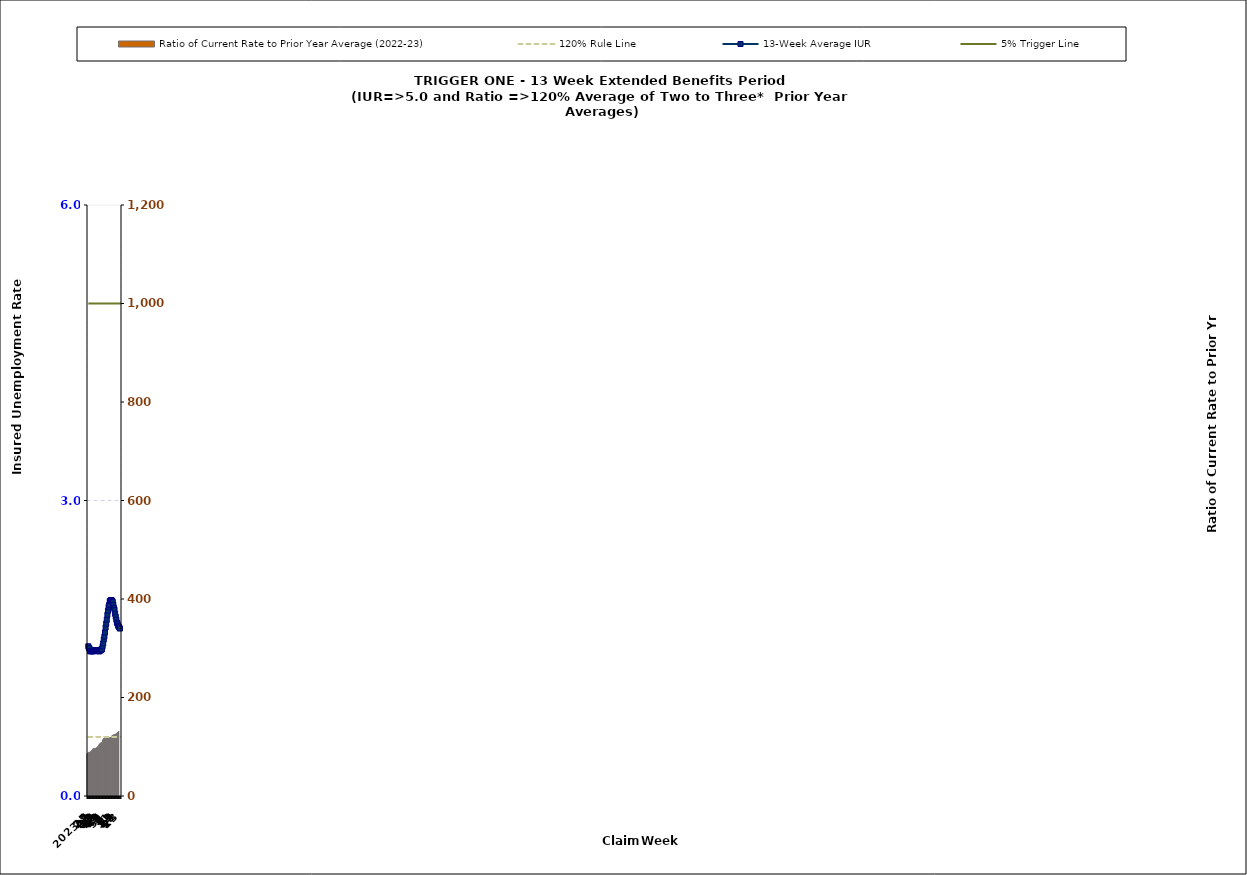
| Category | Ratio of Current Rate to Prior Year Average (2022-23) |
|---|---|
| 2023-23 | 86.11 |
| 2023-24 | 87.2 |
| 25 | 88.75 |
| 26 | 87.5 |
| 27 | 88.82 |
| 28 | 89.63 |
| 29 | 90.18 |
| 30 | 90.74 |
| 31 | 93.03 |
| 32 | 94.53 |
| 33 | 95.79 |
| 34 | 96.1 |
| 35 | 97.04 |
| 36 | 96.1 |
| 37 | 96.41 |
| 38 | 97.68 |
| 39 | 98.33 |
| 40 | 98.98 |
| 41 | 100.68 |
| 42 | 102.08 |
| 43 | 104.22 |
| 44 | 105.71 |
| 45 | 106.81 |
| 46 | 107.97 |
| 47 | 108.57 |
| 48 | 109.54 |
| 49 | 113.57 |
| 50 | 115.71 |
| 51 | 116.9 |
| 52 | 117.52 |
| 1 | 117.44 |
| 2 | 116.99 |
| 3 | 117.94 |
| 4 | 117.86 |
| 5 | 118.15 |
| 6 | 118.29 |
| 7 | 118.2 |
| 8 | 117.85 |
| 9 | 118.45 |
| 10 | 118.8 |
| 11 | 118.91 |
| 12 | 119.75 |
| 13 | 122.78 |
| 14 | 123.22 |
| 15 | 124.34 |
| 16 | 124.16 |
| 17 | 124.65 |
| 18 | 125.17 |
| 19 | 125.26 |
| 20 | 126.81 |
| 21 | 127.67 |
| 22 | 129.32 |
| 23 | 130.03 |
| 2024-24 | 131.78 |